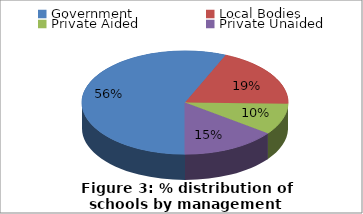
| Category | Series 0 |
|---|---|
| Government | 768759 |
| Local Bodies | 257729 |
| Private Aided | 133946 |
| Private Unaided | 201948 |